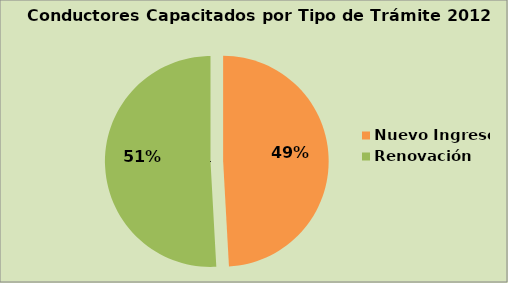
| Category | Series 0 |
|---|---|
| Nuevo Ingreso | 49.122 |
| Renovación | 50.878 |